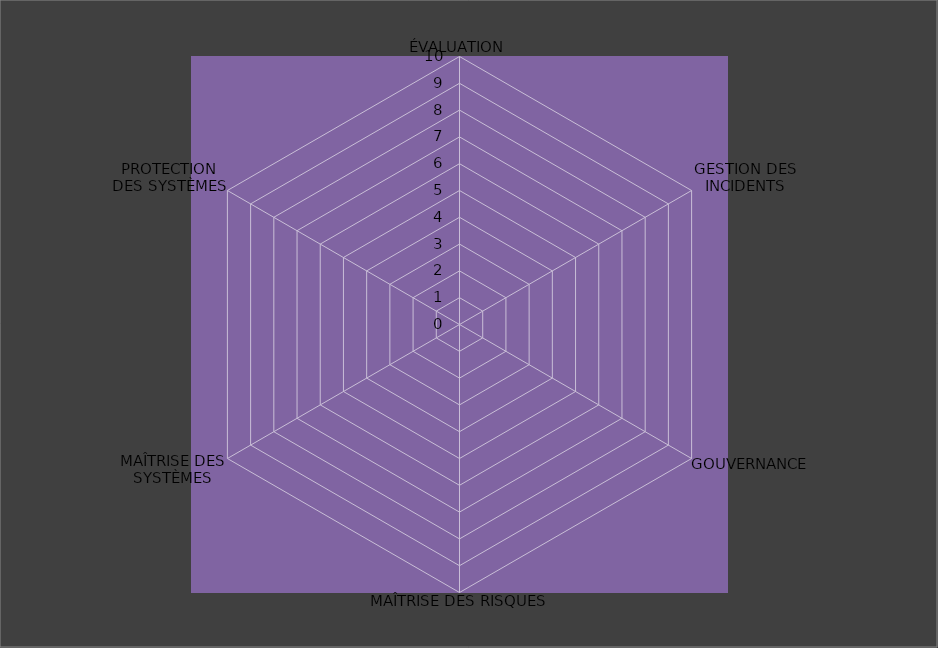
| Category | Année 2023 |
|---|---|
| ÉVALUATION | 0 |
| GESTION DES INCIDENTS | 0 |
| GOUVERNANCE | 0 |
| MAÎTRISE DES RISQUES | 0 |
| MAÎTRISE DES SYSTÈMES | 0 |
| PROTECTION
DES SYSTÈMES | 0 |